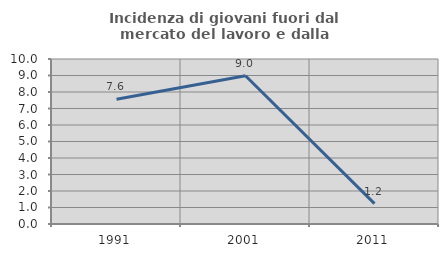
| Category | Incidenza di giovani fuori dal mercato del lavoro e dalla formazione  |
|---|---|
| 1991.0 | 7.563 |
| 2001.0 | 8.982 |
| 2011.0 | 1.235 |